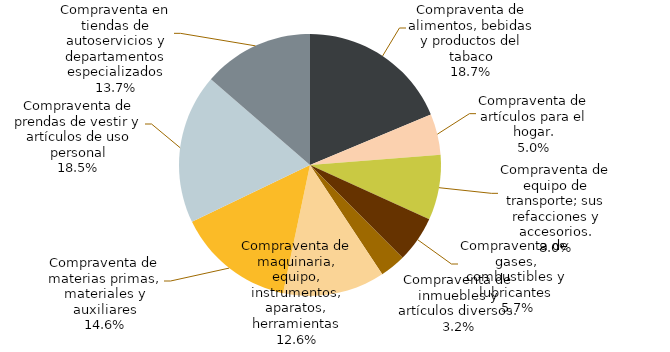
| Category | Series 0 |
|---|---|
| Compraventa de alimentos, bebidas y productos del tabaco. | 0.187 |
| Compraventa de artículos para el hogar. | 0.05 |
| Compraventa de equipo de transporte; sus refacciones y accesorios. | 0.08 |
| Compraventa de gases, combustibles y lubricantes. | 0.057 |
| Compraventa de inmuebles y artículos diversos. | 0.032 |
| Compraventa de maquinaria, equipo, instrumentos, aparatos, herramientas. | 0.126 |
| Compraventa de materias primas, materiales y auxiliares. | 0.146 |
| Compraventa de prendas de vestir y artículos de uso personal. | 0.185 |
| Compraventa en tiendas de autoservicios y departamentos especializados. | 0.137 |